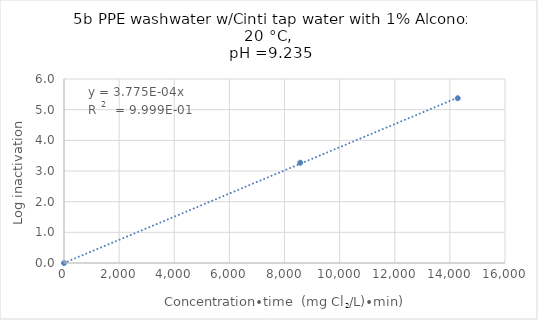
| Category | Series 0 |
|---|---|
| 0.0 | 0 |
| 8571.428571428572 | 3.27 |
| 14285.714285714286 | 5.373 |